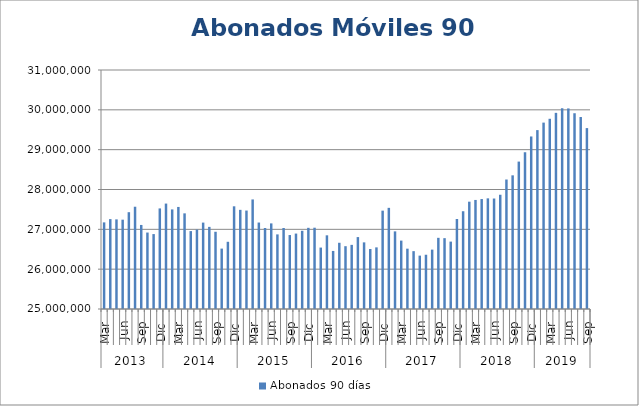
| Category | Abonados 90 días  |
|---|---|
| 0 | 27174429 |
| 1 | 27256799 |
| 2 | 27249896 |
| 3 | 27242396 |
| 4 | 27430194 |
| 5 | 27567464 |
| 6 | 27110010 |
| 7 | 26919316 |
| 8 | 26880609 |
| 9 | 27524963 |
| 10 | 27646717 |
| 11 | 27499992 |
| 12 | 27562088 |
| 13 | 27401040 |
| 14 | 26955717 |
| 15 | 26994609 |
| 16 | 27169188 |
| 17 | 27061687 |
| 18 | 26939071 |
| 19 | 26516500 |
| 20 | 26687326 |
| 21 | 27578143 |
| 22 | 27489223 |
| 23 | 27471553 |
| 24 | 27750473 |
| 25 | 27170692 |
| 26 | 27033211 |
| 27 | 27149172 |
| 28 | 26872979 |
| 29 | 27034173 |
| 30 | 26856662 |
| 31 | 26893632 |
| 32 | 26963755 |
| 33 | 27037951 |
| 34 | 27040824 |
| 35 | 26542149 |
| 36 | 26849710 |
| 37 | 26457447 |
| 38 | 26662676 |
| 39 | 26576782 |
| 40 | 26610099 |
| 41 | 26805521 |
| 42 | 26672717 |
| 43 | 26505805 |
| 44 | 26547173 |
| 45 | 27469211 |
| 46 | 27539556 |
| 47 | 26948853 |
| 48 | 26717067 |
| 49 | 26514588 |
| 50 | 26452370 |
| 51 | 26339907 |
| 52 | 26362130 |
| 53 | 26490787 |
| 54 | 26786764 |
| 55 | 26778405 |
| 56 | 26691976 |
| 57 | 27260107 |
| 58 | 27454349 |
| 59 | 27694179 |
| 60 | 27737550 |
| 61 | 27760296 |
| 62 | 27777818 |
| 63 | 27773600 |
| 64 | 27868225 |
| 65 | 28250702 |
| 66 | 28355724 |
| 67 | 28700770 |
| 68 | 28935345 |
| 69 | 29331337 |
| 70 | 29491024 |
| 71 | 29679237 |
| 72 | 29775295 |
| 73 | 29924167 |
| 74 | 30039747 |
| 75 | 30035533 |
| 76 | 29914508 |
| 77 | 29819526 |
| 78 | 29541515 |